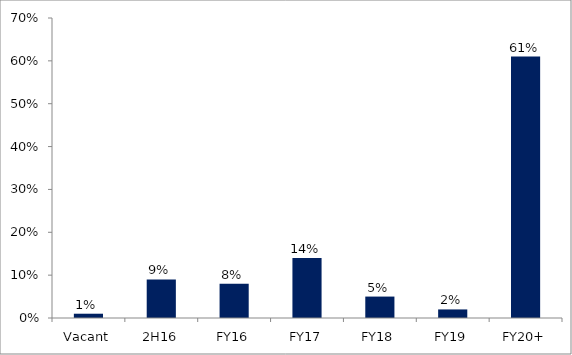
| Category | Series 0 |
|---|---|
| Vacant | 0.01 |
| 2H16 | 0.09 |
| FY16 | 0.08 |
| FY17 | 0.14 |
| FY18 | 0.05 |
| FY19 | 0.02 |
| FY20+ | 0.61 |